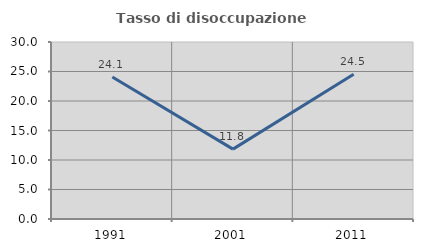
| Category | Tasso di disoccupazione giovanile  |
|---|---|
| 1991.0 | 24.074 |
| 2001.0 | 11.842 |
| 2011.0 | 24.528 |